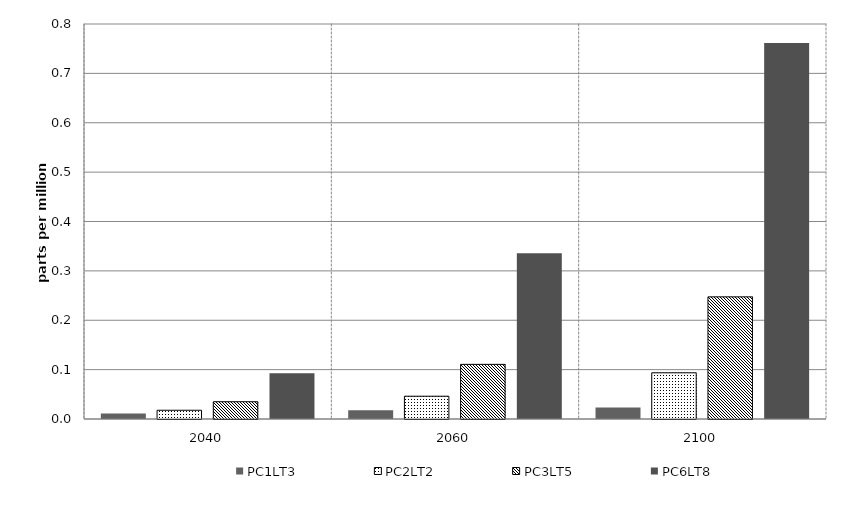
| Category | PC1LT3 | PC2LT2 | PC3LT5 | PC6LT8 | Alt 5 | Alt 6 | Alt 7 | Alt 8 | Alt 10 |
|---|---|---|---|---|---|---|---|---|---|
| 2040.0 | 0.011 | 0.018 | 0.035 | 0.092 |  |  |  |  |  |
| 2060.0 | 0.017 | 0.046 | 0.111 | 0.336 |  |  |  |  |  |
| 2100.0 | 0.023 | 0.094 | 0.247 | 0.761 |  |  |  |  |  |